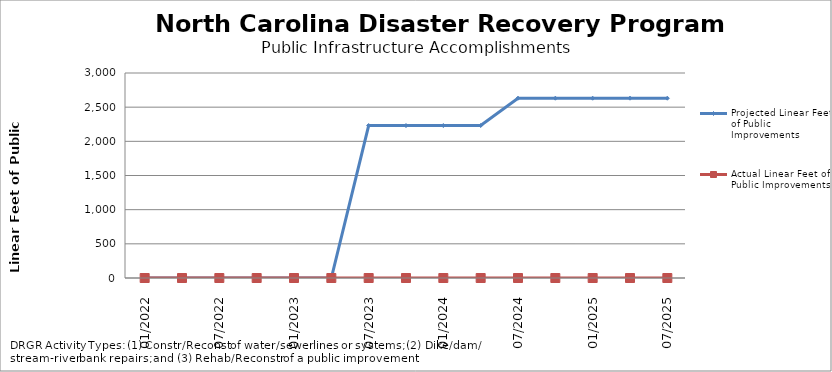
| Category | Projected Linear Feet of Public Improvements | Actual Linear Feet of Public Improvements |
|---|---|---|
| 01/2022 | 0 | 0 |
| 4/2022 | 0 | 0 |
| 07/2022 | 0 | 0 |
| 10/2022 | 0 | 0 |
| 01/2023 | 0 | 0 |
| 4/2023 | 0 | 0 |
| 07/2023 | 2231 | 0 |
| 10/2023 | 2231 | 0 |
| 01/2024 | 2231 | 0 |
| 4/2024 | 2231 | 0 |
| 07/2024 | 2631 | 0 |
| 10/2024 | 2631 | 0 |
| 01/2025 | 2631 | 0 |
| 4/2025 | 2631 | 0 |
| 07/2025 | 2631 | 0 |